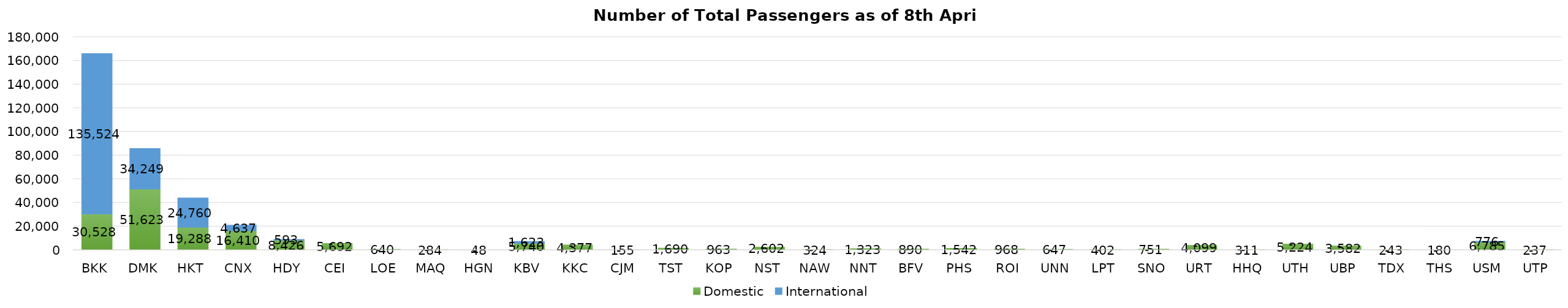
| Category | Domestic | International |
|---|---|---|
| BKK | 30528 | 135524 |
| DMK | 51623 | 34249 |
| HKT | 19288 | 24760 |
| CNX | 16410 | 4637 |
| HDY | 8426 | 593 |
| CEI | 5692 | 0 |
| LOE | 640 | 0 |
| MAQ | 284 | 0 |
| HGN | 48 | 0 |
| KBV | 5740 | 1623 |
| KKC | 4377 | 0 |
| CJM | 155 | 0 |
| TST | 1690 | 0 |
| KOP | 963 | 0 |
| NST | 2602 | 0 |
| NAW | 324 | 0 |
| NNT | 1323 | 0 |
| BFV | 890 | 0 |
| PHS | 1542 | 0 |
| ROI | 968 | 0 |
| UNN | 647 | 0 |
| LPT | 402 | 0 |
| SNO | 751 | 0 |
| URT | 4099 | 0 |
| HHQ | 311 | 0 |
| UTH | 5224 | 0 |
| UBP | 3582 | 0 |
| TDX | 243 | 0 |
| THS | 180 | 0 |
| USM | 6785 | 776 |
| UTP | 237 | 0 |